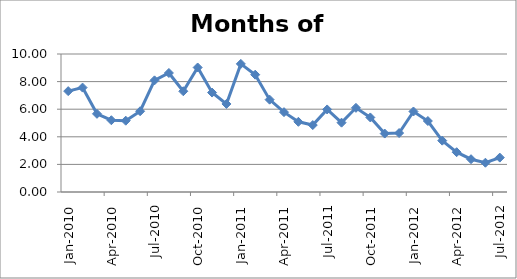
| Category | Series 0 |
|---|---|
| 2010-01-01 | 7.309 |
| 2010-02-01 | 7.566 |
| 2010-03-01 | 5.665 |
| 2010-04-01 | 5.201 |
| 2010-05-01 | 5.166 |
| 2010-06-01 | 5.853 |
| 2010-07-01 | 8.09 |
| 2010-08-01 | 8.625 |
| 2010-09-01 | 7.3 |
| 2010-10-01 | 9.022 |
| 2010-11-01 | 7.207 |
| 2010-12-01 | 6.379 |
| 2011-01-01 | 9.284 |
| 2011-02-01 | 8.5 |
| 2011-03-01 | 6.692 |
| 2011-04-01 | 5.786 |
| 2011-05-01 | 5.086 |
| 2011-06-01 | 4.85 |
| 2011-07-01 | 5.983 |
| 2011-08-01 | 5.025 |
| 2011-09-01 | 6.099 |
| 2011-10-01 | 5.402 |
| 2011-11-01 | 4.235 |
| 2011-12-01 | 4.271 |
| 2012-01-01 | 5.833 |
| 2012-02-01 | 5.144 |
| 2012-03-01 | 3.721 |
| 2012-04-01 | 2.885 |
| 2012-05-01 | 2.376 |
| 2012-06-01 | 2.121 |
| 2012-07-01 | 2.493 |